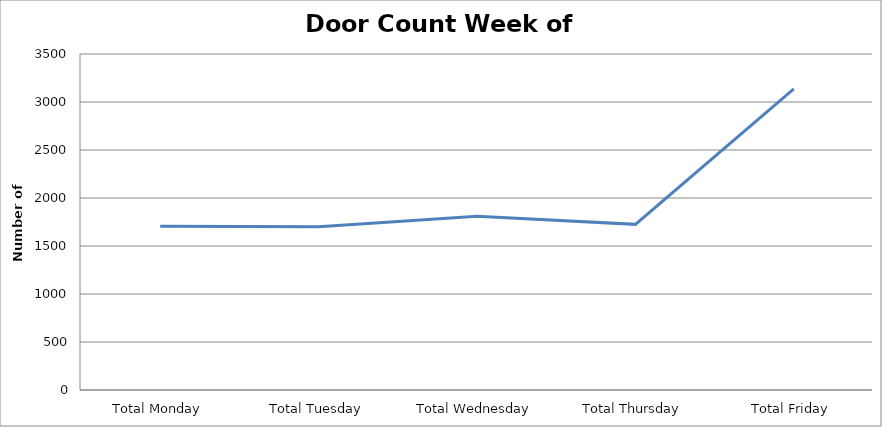
| Category | Series 0 |
|---|---|
| Total Monday | 1704.5 |
| Total Tuesday | 1701.5 |
| Total Wednesday | 1809 |
| Total Thursday | 1725.5 |
| Total Friday | 3136 |